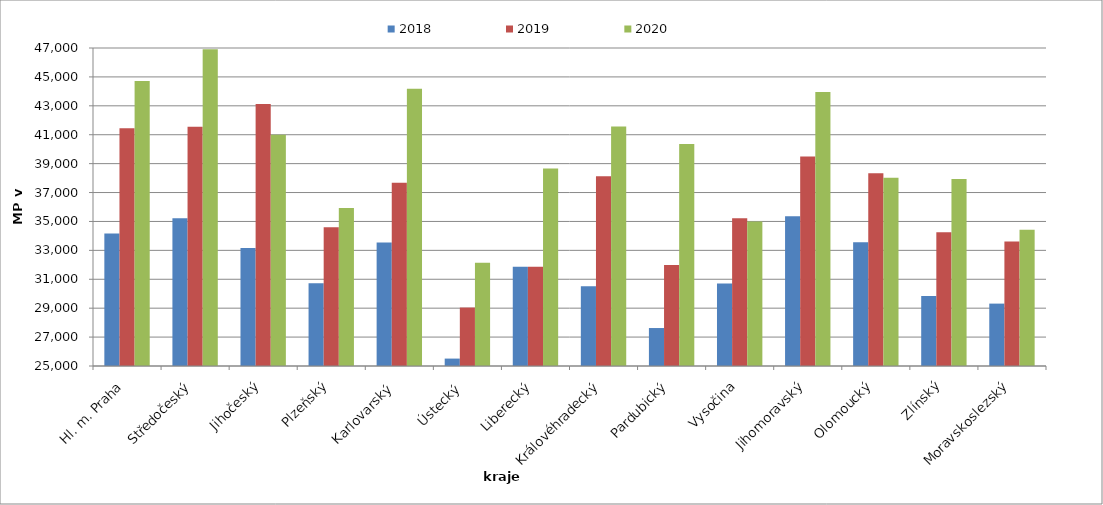
| Category | 2018 | 2019 | 2020 |
|---|---|---|---|
| Hl. m. Praha | 34165.263 | 41441.213 | 44719.354 |
| Středočeský | 35223.354 | 41546.322 | 46915.92 |
| Jihočeský | 33169.416 | 43122.394 | 40991.32 |
| Plzeňský | 30732.189 | 34593.958 | 35934.628 |
| Karlovarský  | 33547.126 | 37673.563 | 44180 |
| Ústecký   | 25512.945 | 29044.472 | 32146.47 |
| Liberecký | 31870.78 | 31870.78 | 38661.406 |
| Královéhradecký | 30514.093 | 38125.925 | 41570.374 |
| Pardubický | 27626.684 | 31979.016 | 40356.762 |
| Vysočina | 30704.957 | 35225.661 | 35005.301 |
| Jihomoravský | 35353.147 | 39494.946 | 43956.006 |
| Olomoucký | 33562.162 | 38341.71 | 38020.683 |
| Zlínský | 29847.319 | 34257.023 | 37934.812 |
| Moravskoslezský | 29316.401 | 33608.171 | 34428.105 |